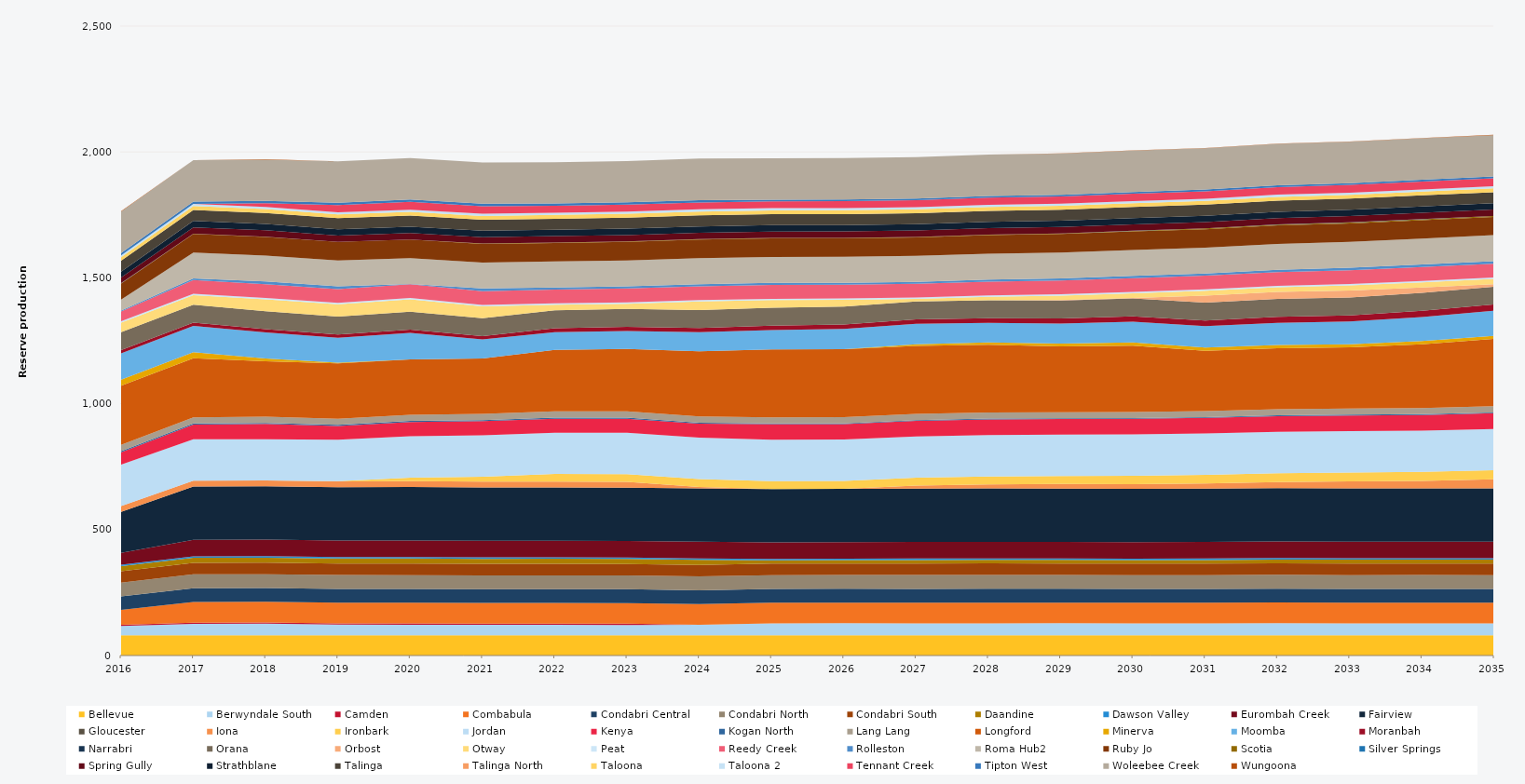
| Category | Bellevue | Berwyndale South | Camden | Combabula | Condabri Central | Condabri North | Condabri South | Daandine | Dawson Valley | Eurombah Creek | Fairview | Gloucester | Iona | Ironbark | Jordan | Kenya | Kogan North | Lang Lang | Longford | Minerva | Moomba | Moranbah | Narrabri | Orana | Orbost | Otway | Peat | Reedy Creek | Rolleston | Roma Hub2 | Ruby Jo | Scotia | Silver Springs | Spring Gully | Strathblane | Talinga | Talinga North | Taloona | Taloona 2 | Tennant Creek | Tipton West | Woleebee Creek | Wungoona |
|---|---|---|---|---|---|---|---|---|---|---|---|---|---|---|---|---|---|---|---|---|---|---|---|---|---|---|---|---|---|---|---|---|---|---|---|---|---|---|---|---|---|---|---|
| 2016 | 80.52 | 36.914 | 5 | 58.549 | 54.254 | 54.473 | 44.816 | 20.13 | 5.856 | 46.759 | 163.483 | 0 | 23.12 | 0 | 164.7 | 49.024 | 4.392 | 24.522 | 235.041 | 23.79 | 105 | 12.867 | 0 | 70.845 | 0 | 38 | 5.49 | 39.21 | 3.89 | 42.654 | 64.014 | 1.196 | 0.497 | 22.605 | 22.951 | 43.348 | 0 | 13.836 | 7.463 | 0 | 9.516 | 164.7 | 1.292 |
| 2017 | 80.3 | 45.348 | 5 | 82.125 | 54.75 | 54.75 | 45.625 | 20.075 | 5.84 | 65.7 | 211.7 | 0 | 23.12 | 0 | 164.25 | 58.676 | 4.38 | 24.455 | 234.501 | 23.725 | 105 | 12.873 | 0 | 71.175 | 0 | 38 | 5.475 | 54.75 | 5.897 | 102.93 | 73.702 | 1.083 | 0.278 | 25.185 | 25.185 | 43.8 | 0 | 15.33 | 8.395 | 0 | 9.49 | 164.25 | 0.608 |
| 2018 | 80.3 | 45.95 | 5 | 82.125 | 54.75 | 54.75 | 45.625 | 20.075 | 5.84 | 65.7 | 211.7 | 0 | 23.12 | 0 | 164.25 | 60.389 | 4.38 | 24.455 | 220 | 11.034 | 104.043 | 13.04 | 0 | 71.175 | 0 | 46.67 | 5.475 | 54.75 | 10.82 | 102.93 | 73.702 | 1.018 | 0.477 | 25.185 | 25.185 | 43.8 | 0 | 15.33 | 8.395 | 14.55 | 9.49 | 164.25 | 1.012 |
| 2019 | 80.3 | 42.593 | 5 | 82.125 | 54.75 | 54.75 | 45.625 | 20.075 | 5.84 | 65.7 | 211.7 | 0 | 23.12 | 1.292 | 164.25 | 54.58 | 4.38 | 24.455 | 220 | 2.129 | 99.202 | 12.81 | 0 | 71.175 | 0 | 48.95 | 5.475 | 54.75 | 10.95 | 102.93 | 73.702 | 0.058 | 0 | 25.185 | 25.185 | 43.8 | 0 | 15.33 | 8.395 | 28.083 | 9.49 | 164.25 | 0 |
| 2020 | 80.52 | 41.633 | 5 | 82.35 | 54.9 | 54.9 | 45.75 | 20.13 | 5.856 | 65.88 | 212.28 | 0 | 23.12 | 14.318 | 164.7 | 55.977 | 4.392 | 24.522 | 220 | 0.073 | 105 | 12.781 | 0 | 71.37 | 0 | 48.95 | 5.49 | 54.9 | 0.673 | 103.212 | 73.873 | 0.059 | 0 | 25.254 | 25.254 | 43.92 | 0 | 15.372 | 8.418 | 30.893 | 9.516 | 164.7 | 0 |
| 2021 | 80.3 | 41.444 | 5 | 82.125 | 54.75 | 54.75 | 45.625 | 20.075 | 5.84 | 65.7 | 211.7 | 0 | 23.12 | 19.943 | 164.25 | 56.183 | 4.38 | 24.455 | 220 | 0 | 75.448 | 13.533 | 0 | 71.175 | 0 | 47.132 | 5.475 | 54.75 | 10.868 | 102.93 | 73.674 | 1.892 | 0 | 25.185 | 25.185 | 43.8 | 0 | 15.33 | 8.395 | 30.387 | 9.49 | 164.25 | 0 |
| 2022 | 80.3 | 41.57 | 5 | 82.125 | 54.75 | 54.75 | 45.625 | 20.075 | 5.84 | 65.7 | 211.7 | 0 | 23.12 | 30.17 | 164.25 | 55.606 | 4.38 | 24.455 | 244.118 | 0 | 70.92 | 15.298 | 0 | 71.175 | 0 | 22.475 | 5.475 | 54.75 | 8.412 | 102.93 | 73.63 | 1.83 | 0 | 25.185 | 25.185 | 43.8 | 0 | 15.33 | 8.395 | 27.517 | 9.49 | 164.25 | 0 |
| 2023 | 80.3 | 41.014 | 5 | 82.125 | 54.75 | 54.75 | 45.625 | 20.075 | 5.84 | 65.7 | 211.7 | 0 | 23.12 | 30.17 | 164.25 | 56.186 | 4.38 | 24.455 | 248.04 | 0 | 71.721 | 16.264 | 0 | 71.175 | 0 | 20.777 | 5.475 | 54.75 | 8.747 | 102.93 | 73.586 | 1.995 | 0 | 25.185 | 25.185 | 43.8 | 0 | 15.33 | 8.395 | 27.672 | 9.49 | 164.25 | 0 |
| 2024 | 80.52 | 41.488 | 0 | 82.35 | 54.9 | 54.9 | 45.75 | 20.13 | 5.856 | 65.88 | 212.28 | 0 | 5.3 | 31.053 | 164.7 | 55.47 | 4.392 | 24.522 | 258.954 | 0 | 75.393 | 16.79 | 0 | 71.37 | 0 | 34.027 | 5.49 | 54.9 | 8.514 | 103.212 | 73.713 | 1.867 | 0.001 | 25.254 | 25.254 | 43.92 | 0 | 15.372 | 8.418 | 27.368 | 9.516 | 164.7 | 0.035 |
| 2025 | 80.3 | 47.417 | 0 | 82.125 | 54.75 | 54.75 | 45.625 | 13.061 | 5.84 | 65.7 | 211.7 | 0 | 0 | 31.394 | 164.25 | 62.079 | 2.801 | 24.455 | 270 | 0 | 76.645 | 17.268 | 0 | 71.175 | 0 | 30.024 | 5.475 | 54.75 | 8.507 | 102.93 | 73.498 | 2.165 | 0.024 | 25.185 | 25.185 | 43.8 | 0 | 15.33 | 8.395 | 27.597 | 6.173 | 164.25 | 0.069 |
| 2026 | 80.3 | 47.82 | 0 | 82.125 | 54.75 | 54.75 | 45.625 | 13.492 | 5.84 | 65.7 | 211.7 | 0 | 0 | 31.196 | 164.25 | 61.678 | 2.871 | 24.455 | 270 | 0 | 80.807 | 17.518 | 0 | 71.175 | 0.011 | 26.601 | 5.475 | 54.75 | 7.599 | 102.93 | 73.455 | 2.063 | 0.025 | 25.185 | 25.185 | 43.8 | 0 | 15.33 | 8.395 | 27.771 | 6.478 | 164.25 | 0.086 |
| 2027 | 80.3 | 47.59 | 0 | 82.125 | 54.75 | 54.75 | 45.625 | 14.116 | 5.84 | 65.7 | 211.7 | 0 | 12.196 | 31.236 | 164.25 | 61.893 | 2.82 | 24.455 | 270 | 7.204 | 80.73 | 18.14 | 0 | 71.175 | 0.097 | 9.491 | 5.475 | 54.75 | 7.702 | 102.93 | 73.411 | 2.224 | 0.072 | 25.185 | 25.185 | 43.8 | 0 | 15.33 | 8.395 | 28.005 | 6.194 | 164.25 | 0.142 |
| 2028 | 80.52 | 47.443 | 0 | 82.35 | 54.9 | 54.9 | 45.75 | 13.972 | 5.856 | 65.88 | 212.28 | 0 | 15.486 | 31.572 | 164.7 | 62.334 | 3.029 | 24.522 | 268.454 | 9.955 | 76.947 | 18.99 | 0 | 71.37 | 0.101 | 13.398 | 5.49 | 54.9 | 7.676 | 103.212 | 73.537 | 2.336 | 0.061 | 25.254 | 25.254 | 43.92 | 0 | 15.372 | 8.418 | 28.198 | 6.468 | 164.7 | 0.128 |
| 2029 | 80.3 | 47.76 | 0 | 82.125 | 54.75 | 54.75 | 45.625 | 14.285 | 5.84 | 65.7 | 211.7 | 0 | 18.502 | 31.877 | 164.25 | 61.739 | 2.914 | 24.455 | 261.023 | 11.095 | 79.712 | 20.344 | 0 | 71.175 | 1.505 | 17.625 | 5.475 | 54.75 | 8.527 | 102.93 | 73.323 | 2.267 | 0.318 | 25.185 | 25.185 | 43.8 | 0 | 15.33 | 8.395 | 28.646 | 6.154 | 164.25 | 0.739 |
| 2030 | 80.3 | 47.4 | 0 | 82.125 | 54.75 | 54.75 | 45.625 | 14.018 | 5.84 | 65.7 | 211.7 | 0 | 18.292 | 33.128 | 164.25 | 62.1 | 2.962 | 24.455 | 263.403 | 12.643 | 82.416 | 21.608 | 0 | 71.175 | 1.566 | 18.552 | 5.475 | 54.75 | 8.893 | 102.93 | 73.279 | 2.649 | 0.407 | 25.185 | 25.185 | 43.8 | 0 | 15.33 | 8.395 | 29.018 | 6.622 | 164.25 | 0.994 |
| 2031 | 80.3 | 47.315 | 0 | 82.125 | 54.75 | 54.75 | 45.625 | 14.474 | 5.84 | 65.7 | 211.7 | 0 | 20.509 | 34.264 | 164.25 | 62.18 | 2.929 | 24.455 | 239.134 | 12.556 | 85.13 | 22.555 | 0 | 71.175 | 27.375 | 19.487 | 5.475 | 54.75 | 8.223 | 102.93 | 73.235 | 2.929 | 0.38 | 25.185 | 25.185 | 43.8 | 0 | 15.33 | 8.395 | 29.387 | 6.774 | 164.25 | 0.995 |
| 2032 | 80.52 | 47.715 | 0 | 82.35 | 54.9 | 54.9 | 45.75 | 15.06 | 5.856 | 65.88 | 212.28 | 0 | 23.655 | 35.162 | 164.7 | 62.074 | 3.219 | 24.522 | 241.848 | 13.288 | 87.912 | 23.473 | 0 | 71.37 | 27.45 | 18.487 | 5.49 | 54.9 | 8.988 | 103.212 | 73.361 | 3.195 | 0.504 | 25.254 | 25.254 | 43.92 | 0 | 15.372 | 8.418 | 30.262 | 6.991 | 164.7 | 1.218 |
| 2033 | 80.3 | 47.4 | 0 | 82.125 | 54.75 | 54.75 | 45.625 | 15.903 | 5.84 | 65.7 | 211.7 | 0 | 27.024 | 35.7 | 164.25 | 62.088 | 3.308 | 24.455 | 243.313 | 11.779 | 90.829 | 23.984 | 0 | 71.175 | 27.375 | 20.408 | 5.475 | 54.75 | 10.131 | 102.93 | 73.147 | 3.525 | 0.612 | 25.185 | 25.185 | 43.8 | 0 | 15.33 | 8.395 | 30.759 | 7.08 | 164.25 | 1.438 |
| 2034 | 80.3 | 47.62 | 0 | 82.125 | 54.75 | 54.75 | 45.625 | 15.747 | 5.84 | 65.7 | 211.7 | 0 | 29.194 | 35.888 | 164.25 | 61.87 | 3.4 | 24.455 | 252.994 | 12.786 | 95.483 | 24.559 | 0 | 71.175 | 21.076 | 21.161 | 5.475 | 54.75 | 10.444 | 102.93 | 73.103 | 3.708 | 0.633 | 25.185 | 25.185 | 43.8 | 0 | 15.33 | 8.395 | 31.073 | 7.332 | 164.25 | 1.459 |
| 2035 | 80.3 | 47.28 | 0 | 82.125 | 54.75 | 54.75 | 45.625 | 15.881 | 5.84 | 65.7 | 211.7 | 0 | 35.879 | 36.003 | 164.25 | 62.22 | 3.356 | 24.455 | 267.672 | 12.068 | 99.428 | 24.812 | 0 | 71.175 | 9.974 | 20.662 | 5.475 | 54.75 | 10.52 | 102.93 | 72.753 | 3.192 | 0.576 | 25.185 | 25.185 | 43.8 | 0 | 15.33 | 8.395 | 31.489 | 7.156 | 164.25 | 1.387 |